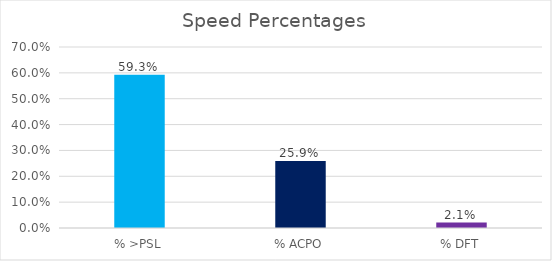
| Category | Series 0 |
|---|---|
| % >PSL | 0.593 |
| % ACPO | 0.259 |
| % DFT | 0.021 |